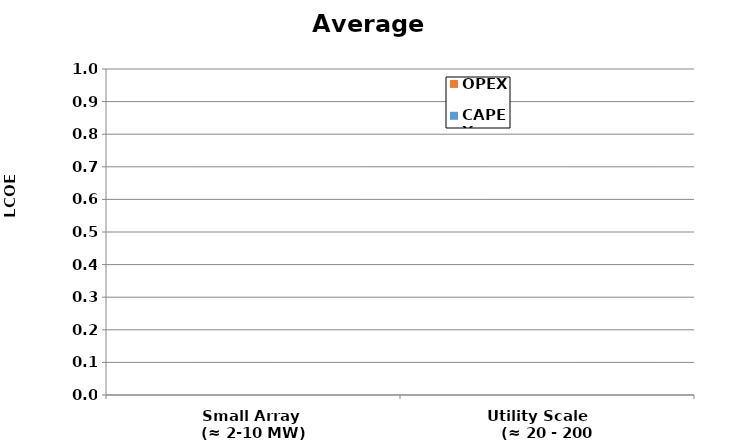
| Category | CAPEX | OPEX |
|---|---|---|
| Small Array 
(≈ 2-10 MW) | 0 | 0 |
| Utility Scale    
(≈ 20 - 200 MW) | 0 | 0 |